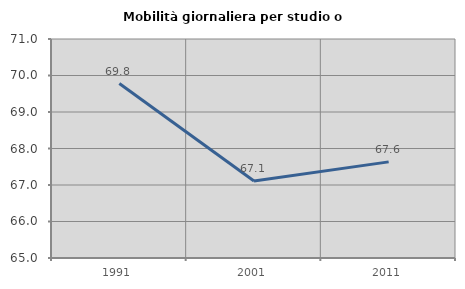
| Category | Mobilità giornaliera per studio o lavoro |
|---|---|
| 1991.0 | 69.78 |
| 2001.0 | 67.108 |
| 2011.0 | 67.633 |